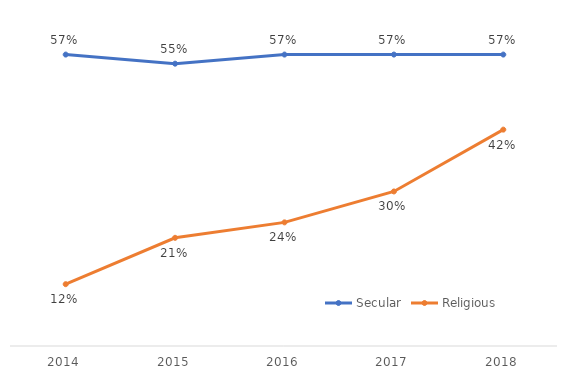
| Category | Secular | Religious |
|---|---|---|
| 2014.0 | 0.571 | 0.121 |
| 2015.0 | 0.554 | 0.212 |
| 2016.0 | 0.571 | 0.242 |
| 2017.0 | 0.571 | 0.303 |
| 2018.0 | 0.571 | 0.424 |